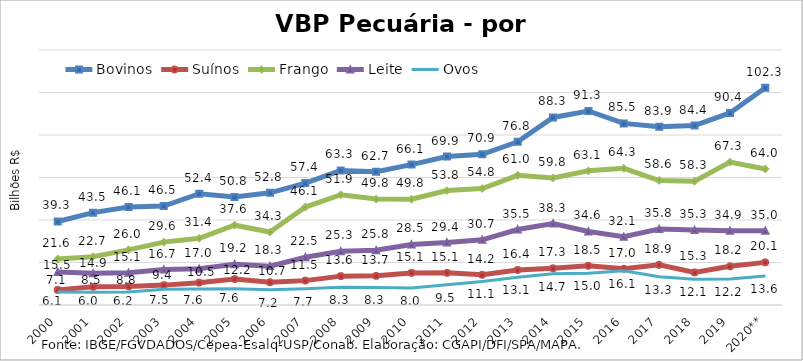
| Category | Bovinos | Suínos | Frango | Leite | Ovos |
|---|---|---|---|---|---|
| 2000 | 39.313 | 7.118 | 21.632 | 15.528 | 6.071 |
| 2001 | 43.456 | 8.54 | 22.737 | 14.942 | 5.983 |
| 2002 | 46.116 | 8.753 | 25.953 | 15.13 | 6.164 |
| 2003 | 46.543 | 9.354 | 29.589 | 16.662 | 7.456 |
| 2004 | 52.366 | 10.517 | 31.42 | 17.029 | 7.557 |
| 2005 | 50.84 | 12.194 | 37.564 | 19.153 | 7.608 |
| 2006 | 52.784 | 10.726 | 34.317 | 18.294 | 7.227 |
| 2007 | 57.364 | 11.47 | 46.108 | 22.49 | 7.681 |
| 2008 | 63.337 | 13.581 | 51.902 | 25.3 | 8.295 |
| 2009 | 62.676 | 13.728 | 49.833 | 25.794 | 8.271 |
| 2010 | 66.08 | 15.103 | 49.773 | 28.486 | 8.044 |
| 2011 | 69.857 | 15.126 | 53.832 | 29.365 | 9.479 |
| 2012 | 70.898 | 14.203 | 54.837 | 30.686 | 11.112 |
| 2013 | 76.828 | 16.445 | 61.034 | 35.509 | 13.069 |
| 2014 | 88.261 | 17.272 | 59.8 | 38.345 | 14.683 |
| 2015 | 91.299 | 18.459 | 63.13 | 34.613 | 14.95 |
| 2016 | 85.46 | 17.035 | 64.325 | 32.117 | 16.118 |
| 2017 | 83.864 | 18.91 | 58.589 | 35.785 | 13.285 |
| 2018 | 84.426 | 15.315 | 58.27 | 35.253 | 12.081 |
| 2019 | 90.381 | 18.196 | 67.268 | 34.924 | 12.208 |
| 2020** | 102.268 | 20.059 | 63.996 | 34.99 | 13.629 |